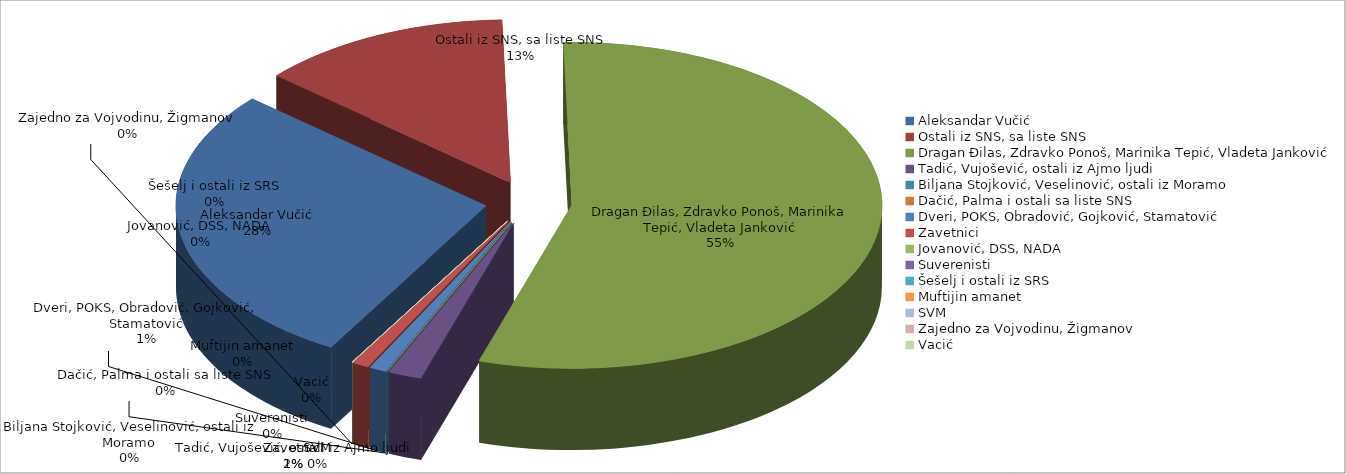
| Category | Series 0 |
|---|---|
| Aleksandar Vučić | 32 |
| Ostali iz SNS, sa liste SNS | 15 |
| Dragan Đilas, Zdravko Ponoš, Marinika Tepić, Vladeta Janković | 63 |
| Tadić, Vujošević, ostali iz Ajmo ljudi | 2 |
| Biljana Stojković, Veselinović, ostali iz Moramo | 0 |
| Dačić, Palma i ostali sa liste SNS | 0 |
| Dveri, POKS, Obradović, Gojković, Stamatović | 1 |
| Zavetnici | 1 |
| Jovanović, DSS, NADA | 0 |
| Suverenisti | 0 |
| Šešelj i ostali iz SRS | 0 |
| Muftijin amanet | 0 |
| SVM | 0 |
| Zajedno za Vojvodinu, Žigmanov | 0 |
| Vacić | 0 |